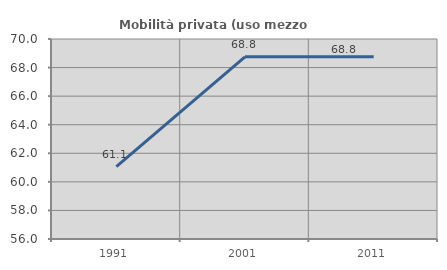
| Category | Mobilità privata (uso mezzo privato) |
|---|---|
| 1991.0 | 61.061 |
| 2001.0 | 68.75 |
| 2011.0 | 68.753 |